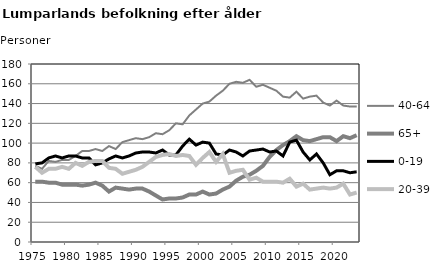
| Category | 40-64 | 65+ | 0-19 | 20-39 |
|---|---|---|---|---|
| 1975.0 | 77 | 61 | 79 | 76 |
| 1976.0 | 74 | 61 | 80 | 70 |
| 1977.0 | 82 | 60 | 85 | 74 |
| 1978.0 | 81 | 60 | 87 | 74 |
| 1979.0 | 83 | 58 | 85 | 76 |
| 1980.0 | 83 | 58 | 87 | 74 |
| 1981.0 | 87 | 58 | 87 | 80 |
| 1982.0 | 92 | 57 | 85 | 77 |
| 1983.0 | 92 | 58 | 85 | 81 |
| 1984.0 | 94 | 60 | 78 | 82 |
| 1985.0 | 92 | 57 | 80 | 82 |
| 1986.0 | 97 | 51 | 84 | 75 |
| 1987.0 | 94 | 55 | 87 | 74 |
| 1988.0 | 101 | 54 | 85 | 69 |
| 1989.0 | 103 | 53 | 87 | 71 |
| 1990.0 | 105 | 54 | 90 | 73 |
| 1991.0 | 104 | 54 | 91 | 76 |
| 1992.0 | 106 | 51 | 91 | 81 |
| 1993.0 | 110 | 47 | 90 | 86 |
| 1994.0 | 109 | 43 | 93 | 88 |
| 1995.0 | 113 | 44 | 88 | 89 |
| 1996.0 | 120 | 44 | 88 | 87 |
| 1997.0 | 119 | 45 | 97 | 88 |
| 1998.0 | 128 | 48 | 104 | 87 |
| 1999.0 | 134 | 48 | 98 | 78 |
| 2000.0 | 140 | 51 | 101 | 85 |
| 2001.0 | 142 | 48 | 100 | 91 |
| 2002.0 | 148 | 49 | 89 | 81 |
| 2003.0 | 153 | 53 | 88 | 89 |
| 2004.0 | 160 | 56 | 93 | 70 |
| 2005.0 | 162 | 62 | 91 | 72 |
| 2006.0 | 161 | 66 | 87 | 73 |
| 2007.0 | 164 | 68 | 92 | 63 |
| 2008.0 | 157 | 72 | 93 | 65 |
| 2009.0 | 159 | 77 | 94 | 61 |
| 2010.0 | 156 | 86 | 91 | 61 |
| 2011.0 | 153 | 93 | 92 | 61 |
| 2012.0 | 147 | 98 | 87 | 60 |
| 2013.0 | 146 | 102 | 101 | 64 |
| 2014.0 | 152 | 107 | 103 | 56 |
| 2015.0 | 145 | 103 | 91 | 59 |
| 2016.0 | 147 | 102 | 83 | 53 |
| 2017.0 | 148 | 104 | 89 | 54 |
| 2018.0 | 141 | 106 | 80 | 55 |
| 2019.0 | 138 | 106 | 68 | 54 |
| 2020.0 | 143 | 102 | 72 | 55 |
| 2021.0 | 138 | 107 | 72 | 59 |
| 2022.0 | 137 | 105 | 70 | 48 |
| 2023.0 | 137 | 108 | 71 | 50 |